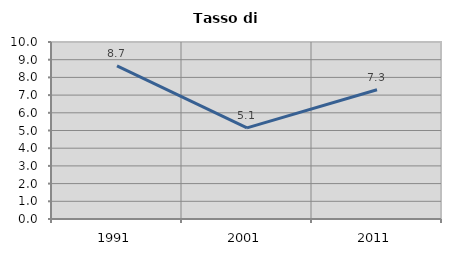
| Category | Tasso di disoccupazione   |
|---|---|
| 1991.0 | 8.652 |
| 2001.0 | 5.15 |
| 2011.0 | 7.302 |